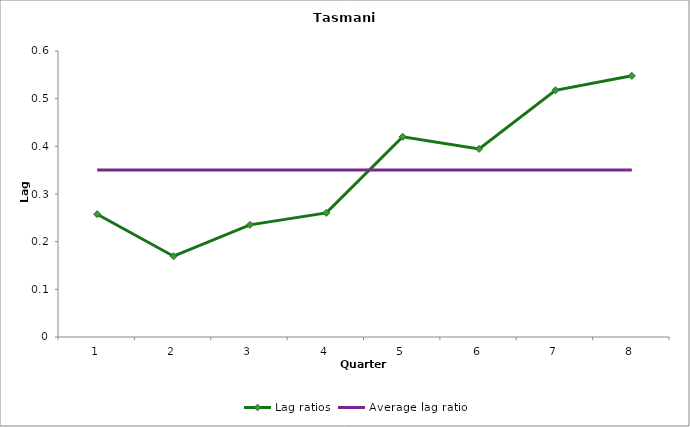
| Category | Lag ratios | Average lag ratio |
|---|---|---|
| 0 | 0.258 | 0.35 |
| 1 | 0.169 | 0.35 |
| 2 | 0.235 | 0.35 |
| 3 | 0.26 | 0.35 |
| 4 | 0.42 | 0.35 |
| 5 | 0.395 | 0.35 |
| 6 | 0.518 | 0.35 |
| 7 | 0.548 | 0.35 |